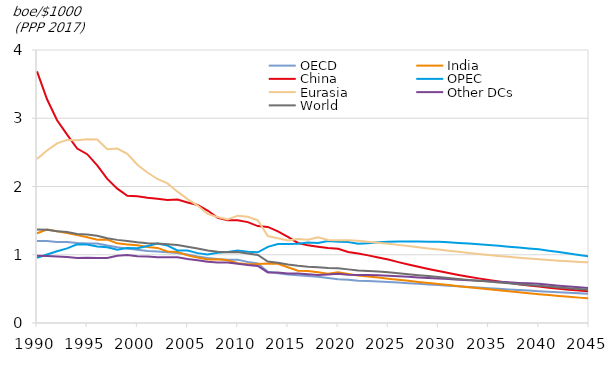
| Category | OECD | India | China | OPEC | Eurasia | Other DCs | World |
|---|---|---|---|---|---|---|---|
| 1990.0 | 1.202 | 1.315 | 3.686 | 0.956 | 2.404 | 0.985 | 1.371 |
| 1991.0 | 1.203 | 1.369 | 3.278 | 1.005 | 2.528 | 0.98 | 1.367 |
| 1992.0 | 1.188 | 1.345 | 2.971 | 1.052 | 2.632 | 0.976 | 1.345 |
| 1993.0 | 1.188 | 1.319 | 2.759 | 1.094 | 2.683 | 0.969 | 1.335 |
| 1994.0 | 1.172 | 1.287 | 2.557 | 1.153 | 2.677 | 0.954 | 1.305 |
| 1995.0 | 1.167 | 1.258 | 2.473 | 1.149 | 2.691 | 0.956 | 1.296 |
| 1996.0 | 1.165 | 1.22 | 2.311 | 1.122 | 2.688 | 0.951 | 1.279 |
| 1997.0 | 1.135 | 1.222 | 2.112 | 1.11 | 2.548 | 0.952 | 1.241 |
| 1998.0 | 1.108 | 1.167 | 1.969 | 1.074 | 2.555 | 0.986 | 1.218 |
| 1999.0 | 1.091 | 1.152 | 1.864 | 1.1 | 2.478 | 0.996 | 1.202 |
| 2000.0 | 1.072 | 1.139 | 1.856 | 1.095 | 2.319 | 0.976 | 1.182 |
| 2001.0 | 1.053 | 1.112 | 1.834 | 1.128 | 2.206 | 0.973 | 1.169 |
| 2002.0 | 1.046 | 1.1 | 1.82 | 1.164 | 2.11 | 0.964 | 1.163 |
| 2003.0 | 1.038 | 1.047 | 1.804 | 1.134 | 2.046 | 0.963 | 1.156 |
| 2004.0 | 1.025 | 1.041 | 1.81 | 1.062 | 1.924 | 0.963 | 1.142 |
| 2005.0 | 1.004 | 0.99 | 1.765 | 1.062 | 1.816 | 0.938 | 1.118 |
| 2006.0 | 0.976 | 0.96 | 1.73 | 1.024 | 1.721 | 0.919 | 1.092 |
| 2007.0 | 0.954 | 0.93 | 1.648 | 1.002 | 1.6 | 0.896 | 1.063 |
| 2008.0 | 0.938 | 0.935 | 1.542 | 1.029 | 1.552 | 0.887 | 1.045 |
| 2009.0 | 0.927 | 0.919 | 1.505 | 1.04 | 1.518 | 0.885 | 1.037 |
| 2010.0 | 0.928 | 0.877 | 1.506 | 1.062 | 1.573 | 0.868 | 1.04 |
| 2011.0 | 0.894 | 0.86 | 1.478 | 1.046 | 1.556 | 0.849 | 1.017 |
| 2012.0 | 0.873 | 0.863 | 1.42 | 1.036 | 1.505 | 0.836 | 0.996 |
| 2013.0 | 0.752 | 0.872 | 1.408 | 1.115 | 1.274 | 0.741 | 0.901 |
| 2014.0 | 0.729 | 0.868 | 1.344 | 1.159 | 1.241 | 0.741 | 0.883 |
| 2015.0 | 0.712 | 0.817 | 1.262 | 1.159 | 1.21 | 0.725 | 0.856 |
| 2016.0 | 0.701 | 0.766 | 1.173 | 1.16 | 1.23 | 0.725 | 0.837 |
| 2017.0 | 0.688 | 0.762 | 1.138 | 1.179 | 1.219 | 0.716 | 0.825 |
| 2018.0 | 0.678 | 0.742 | 1.117 | 1.173 | 1.257 | 0.704 | 0.817 |
| 2019.0 | 0.66 | 0.721 | 1.1 | 1.2 | 1.216 | 0.711 | 0.806 |
| 2020.0 | 0.643 | 0.743 | 1.088 | 1.192 | 1.212 | 0.721 | 0.802 |
| 2021.0 | 0.635 | 0.719 | 1.039 | 1.187 | 1.211 | 0.708 | 0.786 |
| 2022.0 | 0.62 | 0.697 | 1.018 | 1.162 | 1.205 | 0.704 | 0.77 |
| 2023.0 | 0.615 | 0.682 | 0.991 | 1.168 | 1.191 | 0.704 | 0.763 |
| 2024.0 | 0.609 | 0.665 | 0.96 | 1.182 | 1.177 | 0.699 | 0.754 |
| 2025.0 | 0.602 | 0.65 | 0.929 | 1.191 | 1.161 | 0.692 | 0.743 |
| 2026.0 | 0.593 | 0.634 | 0.892 | 1.193 | 1.145 | 0.685 | 0.729 |
| 2027.0 | 0.583 | 0.618 | 0.857 | 1.193 | 1.128 | 0.676 | 0.715 |
| 2028.0 | 0.574 | 0.602 | 0.824 | 1.193 | 1.111 | 0.668 | 0.701 |
| 2029.0 | 0.565 | 0.587 | 0.792 | 1.192 | 1.093 | 0.659 | 0.687 |
| 2030.0 | 0.557 | 0.571 | 0.762 | 1.191 | 1.075 | 0.651 | 0.674 |
| 2031.0 | 0.547 | 0.555 | 0.733 | 1.182 | 1.059 | 0.643 | 0.659 |
| 2032.0 | 0.538 | 0.539 | 0.704 | 1.173 | 1.042 | 0.635 | 0.645 |
| 2033.0 | 0.528 | 0.524 | 0.678 | 1.164 | 1.027 | 0.627 | 0.632 |
| 2034.0 | 0.519 | 0.508 | 0.654 | 1.154 | 1.011 | 0.619 | 0.619 |
| 2035.0 | 0.511 | 0.494 | 0.631 | 1.145 | 0.997 | 0.611 | 0.606 |
| 2036.0 | 0.501 | 0.478 | 0.609 | 1.132 | 0.983 | 0.603 | 0.593 |
| 2037.0 | 0.492 | 0.464 | 0.588 | 1.119 | 0.969 | 0.595 | 0.581 |
| 2038.0 | 0.483 | 0.45 | 0.568 | 1.106 | 0.957 | 0.588 | 0.569 |
| 2039.0 | 0.475 | 0.436 | 0.55 | 1.092 | 0.945 | 0.581 | 0.557 |
| 2040.0 | 0.467 | 0.423 | 0.534 | 1.079 | 0.934 | 0.573 | 0.546 |
| 2041.0 | 0.458 | 0.409 | 0.517 | 1.059 | 0.923 | 0.56 | 0.533 |
| 2042.0 | 0.45 | 0.396 | 0.502 | 1.039 | 0.913 | 0.547 | 0.521 |
| 2043.0 | 0.442 | 0.384 | 0.488 | 1.018 | 0.904 | 0.535 | 0.509 |
| 2044.0 | 0.435 | 0.372 | 0.476 | 0.997 | 0.895 | 0.522 | 0.498 |
| 2045.0 | 0.427 | 0.36 | 0.464 | 0.976 | 0.888 | 0.51 | 0.487 |